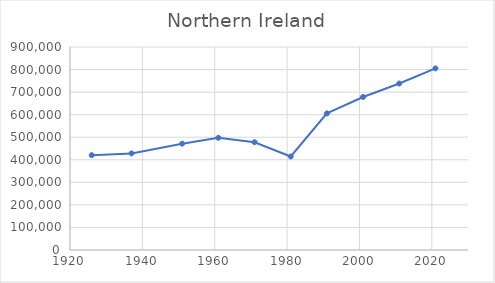
| Category | Series 0 |
|---|---|
| 1926.0 | 420428 |
| 1937.0 | 428290 |
| 1951.0 | 471460 |
| 1961.0 | 497547 |
| 1971.0 | 477919 |
| 1981.0 | 414532 |
| 1991.0 | 605639 |
| 2001.0 | 678462 |
| 2011.0 | 738033 |
| 2021.0 | 805151 |